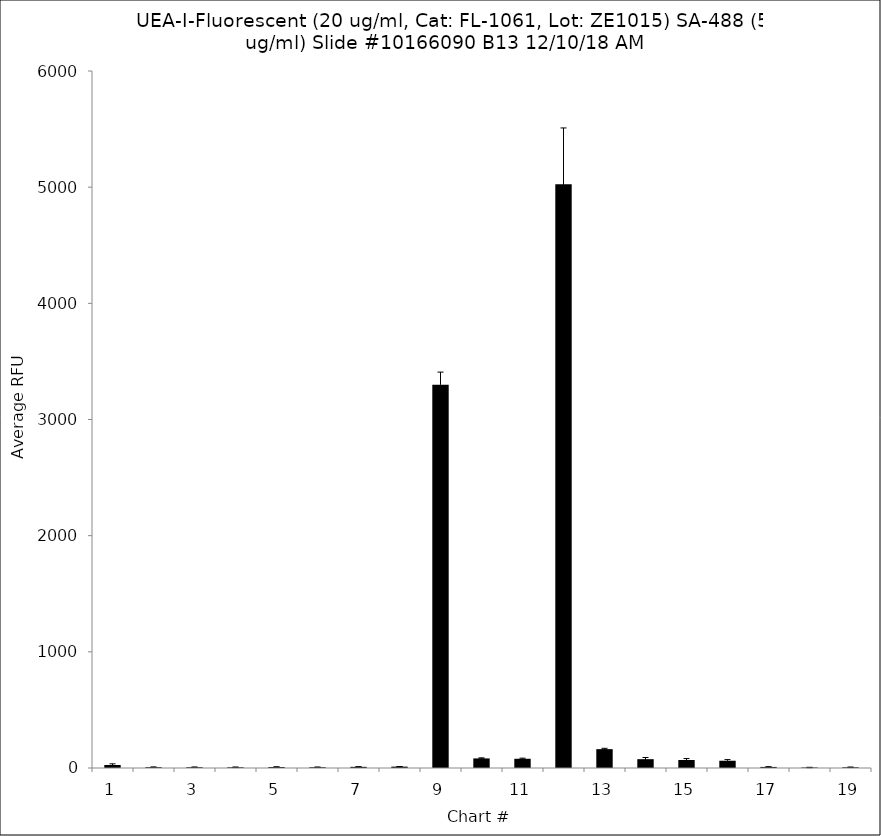
| Category | Series 0 |
|---|---|
| 1.0 | 26 |
| 2.0 | 7 |
| 3.0 | 6.75 |
| 4.0 | 6.25 |
| 5.0 | 8.5 |
| 6.0 | 6.75 |
| 7.0 | 10 |
| 8.0 | 11.75 |
| 9.0 | 3299 |
| 10.0 | 82.5 |
| 11.0 | 79.5 |
| 12.0 | 5026 |
| 13.0 | 162.25 |
| 14.0 | 76 |
| 15.0 | 68.75 |
| 16.0 | 62.5 |
| 17.0 | 9.25 |
| 18.0 | 4.25 |
| 19.0 | 6.25 |